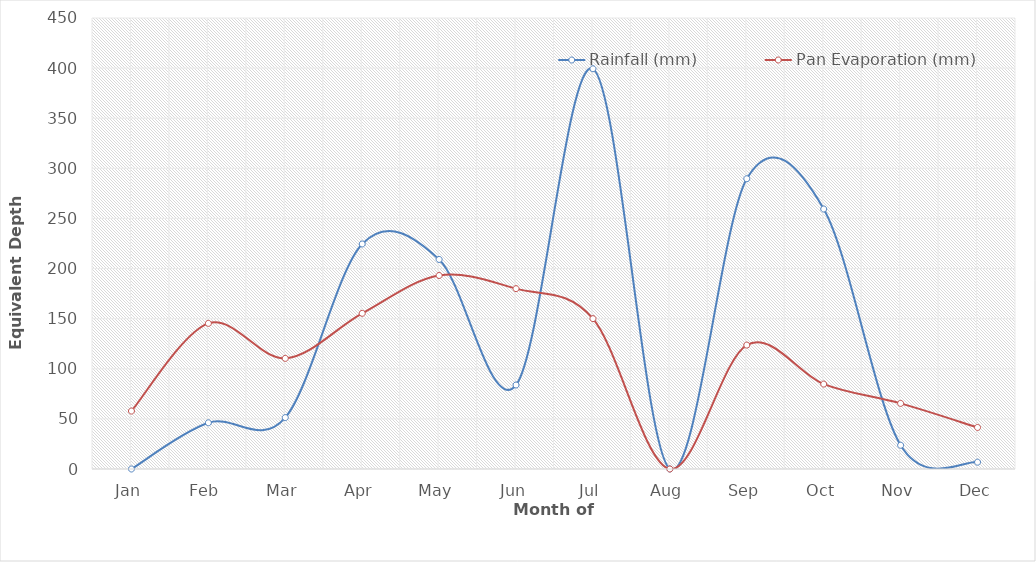
| Category | Rainfall (mm) | Pan Evaporation (mm) |
|---|---|---|
| Jan | 0 | 57.838 |
| Feb | 46.104 | 145.317 |
| Mar | 51.299 | 110.393 |
| Apr | 224.513 | 155.334 |
| May | 209.091 | 193.079 |
| Jun | 83.799 | 179.957 |
| Jul | 399.351 | 150.018 |
| Aug | 0 | 0 |
| Sep | 289.61 | 123.651 |
| Oct | 259.416 | 84.74 |
| Nov | 23.701 | 65.456 |
| Dec | 6.818 | 41.452 |